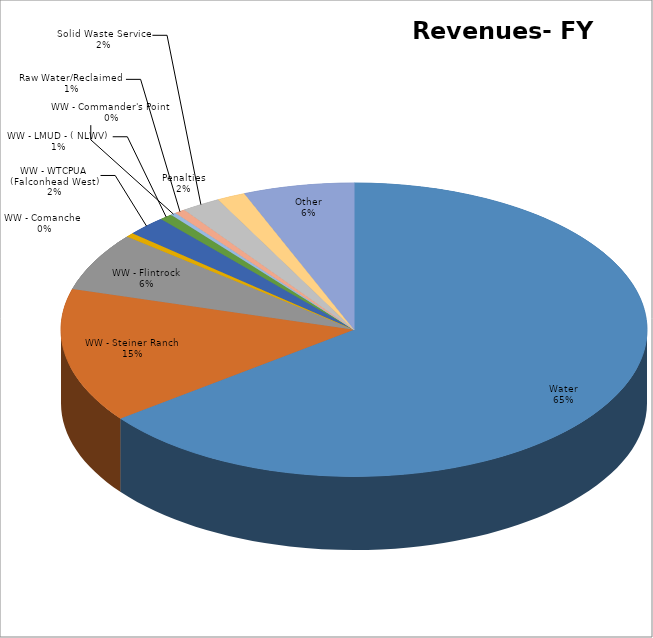
| Category | Series 0 | Series 1 |
|---|---|---|
| Water | 12447800 | 0.647 |
| WW - Steiner Ranch | 2850600 | 0.148 |
| WW - Flintrock | 1240000 | 0.064 |
| WW - Comanche  | 92000 | 0.005 |
| WW - WTCPUA (Falconhead West) | 420000 | 0.022 |
| WW - LMUD - ( NLWV) | 138000 | 0.007 |
| WW - Commander's Point | 57000 | 0.003 |
| Raw Water/Reclaimed | 113500 | 0.006 |
| Solid Waste Service | 415000 | 0.022 |
| Penalties | 302100 | 0.016 |
| Other | 1174950 | 0.061 |